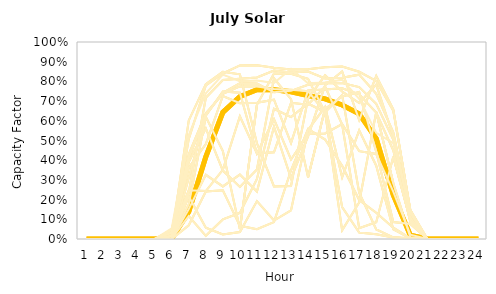
| Category | Series 0 | Series 52 | Series 53 | Series 54 | Series 55 | Series 56 | Series 57 | Series 58 | Series 59 | Series 60 | Series 61 | Series 62 | Series 63 | Series 64 | Series 65 | Series 66 | Series 67 | Series 68 | Series 69 | Series 70 | Series 71 | Series 72 | Series 73 | Series 74 | Series 75 | Series 76 | Series 77 | Series 78 | Series 79 | Series 80 | Series 81 | Series 82 | Series 83 | Series 84 | Series 85 | Series 86 | Series 87 | Series 88 | Series 89 | Series 90 | Series 91 | Series 92 | Series 93 | Series 94 | Series 95 | Series 96 | Series 97 | Series 98 | Series 99 | Series 100 | Series 101 | Series 1 | Series 2 | Series 3 | Series 4 | Series 5 | Series 6 | Series 7 | Series 8 | Series 9 | Series 10 | Series 11 | Series 12 | Series 13 | Series 14 | Series 15 | Series 16 | Series 17 | Series 18 | Series 19 | Series 20 | Series 21 | Series 22 | Series 23 | Series 24 | Series 25 | Series 26 | Series 27 | Series 28 | Series 29 | Series 30 | Series 31 | Series 32 | Series 33 | Series 34 | Series 35 | Series 36 | Series 37 | Series 38 | Series 39 | Series 40 | Series 41 | Series 42 | Series 43 | Series 44 | Series 45 | Series 46 | Series 47 | Series 48 | Series 49 | Series 50 | Series 51 |
|---|---|---|---|---|---|---|---|---|---|---|---|---|---|---|---|---|---|---|---|---|---|---|---|---|---|---|---|---|---|---|---|---|---|---|---|---|---|---|---|---|---|---|---|---|---|---|---|---|---|---|---|---|---|---|---|---|---|---|---|---|---|---|---|---|---|---|---|---|---|---|---|---|---|---|---|---|---|---|---|---|---|---|---|---|---|---|---|---|---|---|---|---|---|---|---|---|---|---|---|---|---|---|
| 0 | 0 | 0 |  |  |  | 0 |  |  |  | 0 |  |  |  | 0 |  |  |  | 0 |  | 0 |  | 0 |  | 0 |  | 0 |  |  |  | 0 |  |  |  | 0 |  |  |  | 0 |  |  |  | 0 |  |  |  | 0 |  |  |  |  | 0 | 0 | 0 |  |  |  | 0 |  |  |  | 0 |  |  |  | 0 |  |  |  | 0 |  | 0 |  | 0 |  | 0 |  | 0 |  |  |  | 0 |  |  |  | 0 |  |  |  | 0 |  |  |  | 0 |  |  |  | 0 |  |  |  |  | 0 |
| 1 | 0 | 0 |  |  |  | 0 |  |  |  | 0 |  |  |  | 0 |  |  |  | 0 |  | 0 |  | 0 |  | 0 |  | 0 |  |  |  | 0 |  |  |  | 0 |  |  |  | 0 |  |  |  | 0 |  |  |  | 0 |  |  |  |  | 0 | 0 | 0 |  |  |  | 0 |  |  |  | 0 |  |  |  | 0 |  |  |  | 0 |  | 0 |  | 0 |  | 0 |  | 0 |  |  |  | 0 |  |  |  | 0 |  |  |  | 0 |  |  |  | 0 |  |  |  | 0 |  |  |  |  | 0 |
| 2 | 0 | 0 |  |  |  | 0 |  |  |  | 0 |  |  |  | 0 |  |  |  | 0 |  | 0 |  | 0 |  | 0 |  | 0 |  |  |  | 0 |  |  |  | 0 |  |  |  | 0 |  |  |  | 0 |  |  |  | 0 |  |  |  |  | 0 | 0 | 0 |  |  |  | 0 |  |  |  | 0 |  |  |  | 0 |  |  |  | 0 |  | 0 |  | 0 |  | 0 |  | 0 |  |  |  | 0 |  |  |  | 0 |  |  |  | 0 |  |  |  | 0 |  |  |  | 0 |  |  |  |  | 0 |
| 3 | 0 | 0 |  |  |  | 0 |  |  |  | 0 |  |  |  | 0 |  |  |  | 0 |  | 0 |  | 0 |  | 0 |  | 0 |  |  |  | 0 |  |  |  | 0 |  |  |  | 0 |  |  |  | 0 |  |  |  | 0 |  |  |  |  | 0 | 0 | 0 |  |  |  | 0 |  |  |  | 0 |  |  |  | 0 |  |  |  | 0 |  | 0 |  | 0 |  | 0 |  | 0 |  |  |  | 0 |  |  |  | 0 |  |  |  | 0 |  |  |  | 0 |  |  |  | 0 |  |  |  |  | 0 |
| 4 | 0 | 0 |  |  |  | 0 |  |  |  | 0 |  |  |  | 0 |  |  |  | 0 |  | 0 |  | 0 |  | 0 |  | 0 |  |  |  | 0 |  |  |  | 0 |  |  |  | 0 |  |  |  | 0 |  |  |  | 0 |  |  |  |  | 0 | 0 | 0 |  |  |  | 0 |  |  |  | 0 |  |  |  | 0 |  |  |  | 0 |  | 0 |  | 0 |  | 0 |  | 0 |  |  |  | 0 |  |  |  | 0 |  |  |  | 0 |  |  |  | 0 |  |  |  | 0 |  |  |  |  | 0 |
| 5 | 0.003 | 0.013 |  |  |  | 0.046 |  |  |  | 0.035 |  |  |  | 0.054 |  |  |  | 0.003 |  | 0.031 |  | 0 |  | 0.017 |  | 0.002 |  |  |  | 0.015 |  |  |  | 0.001 |  |  |  | 0 |  |  |  | 0 |  |  |  | 0 |  |  |  |  | 0 | 0.003 | 0.013 |  |  |  | 0.046 |  |  |  | 0.035 |  |  |  | 0.054 |  |  |  | 0.003 |  | 0.031 |  | 0 |  | 0.017 |  | 0.002 |  |  |  | 0.015 |  |  |  | 0.001 |  |  |  | 0 |  |  |  | 0 |  |  |  | 0 |  |  |  |  | 0 |
| 6 | 0.139 | 0.602 |  |  |  | 0.43 |  |  |  | 0.247 |  |  |  | 0.528 |  |  |  | 0.236 |  | 0.41 |  | 0.152 |  | 0.39 |  | 0.117 |  |  |  | 0.362 |  |  |  | 0.175 |  |  |  | 0.508 |  |  |  | 0.069 |  |  |  | 0.311 |  |  |  |  | 0.216 | 0.139 | 0.602 |  |  |  | 0.43 |  |  |  | 0.247 |  |  |  | 0.528 |  |  |  | 0.236 |  | 0.41 |  | 0.152 |  | 0.39 |  | 0.117 |  |  |  | 0.362 |  |  |  | 0.175 |  |  |  | 0.508 |  |  |  | 0.069 |  |  |  | 0.311 |  |  |  |  | 0.216 |
| 7 | 0.417 | 0.786 |  |  |  | 0.638 |  |  |  | 0.244 |  |  |  | 0.74 |  |  |  | 0.717 |  | 0.63 |  | 0.326 |  | 0.562 |  | 0.016 |  |  |  | 0.482 |  |  |  | 0.621 |  |  |  | 0.779 |  |  |  | 0.241 |  |  |  | 0.626 |  |  |  |  | 0.057 | 0.417 | 0.786 |  |  |  | 0.638 |  |  |  | 0.244 |  |  |  | 0.74 |  |  |  | 0.717 |  | 0.63 |  | 0.326 |  | 0.562 |  | 0.016 |  |  |  | 0.482 |  |  |  | 0.621 |  |  |  | 0.779 |  |  |  | 0.241 |  |  |  | 0.626 |  |  |  |  | 0.057 |
| 8 | 0.643 | 0.849 |  |  |  | 0.736 |  |  |  | 0.351 |  |  |  | 0.834 |  |  |  | 0.807 |  | 0.742 |  | 0.267 |  | 0.347 |  | 0.099 |  |  |  | 0.726 |  |  |  | 0.446 |  |  |  | 0.84 |  |  |  | 0.247 |  |  |  | 0.749 |  |  |  |  | 0.023 | 0.643 | 0.849 |  |  |  | 0.736 |  |  |  | 0.351 |  |  |  | 0.834 |  |  |  | 0.807 |  | 0.742 |  | 0.267 |  | 0.347 |  | 0.099 |  |  |  | 0.726 |  |  |  | 0.446 |  |  |  | 0.84 |  |  |  | 0.247 |  |  |  | 0.749 |  |  |  |  | 0.023 |
| 9 | 0.723 | 0.836 |  |  |  | 0.775 |  |  |  | 0.623 |  |  |  | 0.801 |  |  |  | 0.814 |  | 0.79 |  | 0.327 |  | 0.265 |  | 0.133 |  |  |  | 0.689 |  |  |  | 0.051 |  |  |  | 0.881 |  |  |  | 0.067 |  |  |  | 0.742 |  |  |  |  | 0.035 | 0.723 | 0.836 |  |  |  | 0.775 |  |  |  | 0.623 |  |  |  | 0.801 |  |  |  | 0.814 |  | 0.79 |  | 0.327 |  | 0.265 |  | 0.133 |  |  |  | 0.689 |  |  |  | 0.051 |  |  |  | 0.881 |  |  |  | 0.067 |  |  |  | 0.742 |  |  |  |  | 0.035 |
| 10 | 0.757 | 0.486 |  |  |  | 0.774 |  |  |  | 0.434 |  |  |  | 0.805 |  |  |  | 0.82 |  | 0.789 |  | 0.241 |  | 0.353 |  | 0.304 |  |  |  | 0.691 |  |  |  | 0.681 |  |  |  | 0.881 |  |  |  | 0.05 |  |  |  | 0.434 |  |  |  |  | 0.192 | 0.757 | 0.486 |  |  |  | 0.774 |  |  |  | 0.434 |  |  |  | 0.805 |  |  |  | 0.82 |  | 0.789 |  | 0.241 |  | 0.353 |  | 0.304 |  |  |  | 0.691 |  |  |  | 0.681 |  |  |  | 0.881 |  |  |  | 0.05 |  |  |  | 0.434 |  |  |  |  | 0.192 |
| 11 | 0.758 | 0.267 |  |  |  | 0.761 |  |  |  | 0.44 |  |  |  | 0.792 |  |  |  | 0.855 |  | 0.745 |  | 0.57 |  | 0.816 |  | 0.661 |  |  |  | 0.707 |  |  |  | 0.84 |  |  |  | 0.869 |  |  |  | 0.086 |  |  |  | 0.608 |  |  |  |  | 0.094 | 0.758 | 0.267 |  |  |  | 0.761 |  |  |  | 0.44 |  |  |  | 0.792 |  |  |  | 0.855 |  | 0.745 |  | 0.57 |  | 0.816 |  | 0.661 |  |  |  | 0.707 |  |  |  | 0.84 |  |  |  | 0.869 |  |  |  | 0.086 |  |  |  | 0.608 |  |  |  |  | 0.094 |
| 12 | 0.747 | 0.269 |  |  |  | 0.757 |  |  |  | 0.691 |  |  |  | 0.864 |  |  |  | 0.845 |  | 0.752 |  | 0.308 |  | 0.71 |  | 0.619 |  |  |  | 0.487 |  |  |  | 0.838 |  |  |  | 0.86 |  |  |  | 0.349 |  |  |  | 0.404 |  |  |  |  | 0.145 | 0.747 | 0.269 |  |  |  | 0.757 |  |  |  | 0.691 |  |  |  | 0.864 |  |  |  | 0.845 |  | 0.752 |  | 0.308 |  | 0.71 |  | 0.619 |  |  |  | 0.487 |  |  |  | 0.838 |  |  |  | 0.86 |  |  |  | 0.349 |  |  |  | 0.404 |  |  |  |  | 0.145 |
| 13 | 0.728 | 0.714 |  |  |  | 0.75 |  |  |  | 0.682 |  |  |  | 0.791 |  |  |  | 0.85 |  | 0.783 |  | 0.521 |  | 0.314 |  | 0.688 |  |  |  | 0.754 |  |  |  | 0.813 |  |  |  | 0.862 |  |  |  | 0.559 |  |  |  | 0.533 |  |  |  |  | 0.553 | 0.728 | 0.714 |  |  |  | 0.75 |  |  |  | 0.682 |  |  |  | 0.791 |  |  |  | 0.85 |  | 0.783 |  | 0.521 |  | 0.314 |  | 0.688 |  |  |  | 0.754 |  |  |  | 0.813 |  |  |  | 0.862 |  |  |  | 0.559 |  |  |  | 0.533 |  |  |  |  | 0.553 |
| 14 | 0.711 | 0.831 |  |  |  | 0.641 |  |  |  | 0.773 |  |  |  | 0.795 |  |  |  | 0.815 |  | 0.79 |  | 0.78 |  | 0.661 |  | 0.644 |  |  |  | 0.759 |  |  |  | 0.643 |  |  |  | 0.871 |  |  |  | 0.505 |  |  |  | 0.536 |  |  |  |  | 0.67 | 0.711 | 0.831 |  |  |  | 0.641 |  |  |  | 0.773 |  |  |  | 0.795 |  |  |  | 0.815 |  | 0.79 |  | 0.78 |  | 0.661 |  | 0.644 |  |  |  | 0.759 |  |  |  | 0.643 |  |  |  | 0.871 |  |  |  | 0.505 |  |  |  | 0.536 |  |  |  |  | 0.67 |
| 15 | 0.68 | 0.749 |  |  |  | 0.162 |  |  |  | 0.581 |  |  |  | 0.808 |  |  |  | 0.819 |  | 0.792 |  | 0.85 |  | 0.724 |  | 0.731 |  |  |  | 0.765 |  |  |  | 0.044 |  |  |  | 0.876 |  |  |  | 0.371 |  |  |  | 0.583 |  |  |  |  | 0.313 | 0.68 | 0.749 |  |  |  | 0.162 |  |  |  | 0.581 |  |  |  | 0.808 |  |  |  | 0.819 |  | 0.792 |  | 0.85 |  | 0.724 |  | 0.731 |  |  |  | 0.765 |  |  |  | 0.044 |  |  |  | 0.876 |  |  |  | 0.371 |  |  |  | 0.583 |  |  |  |  | 0.313 |
| 16 | 0.635 | 0.691 |  |  |  | 0.033 |  |  |  | 0.055 |  |  |  | 0.712 |  |  |  | 0.834 |  | 0.771 |  | 0.604 |  | 0.746 |  | 0.235 |  |  |  | 0.735 |  |  |  | 0.185 |  |  |  | 0.849 |  |  |  | 0.198 |  |  |  | 0.446 |  |  |  |  | 0.552 | 0.635 | 0.691 |  |  |  | 0.033 |  |  |  | 0.055 |  |  |  | 0.712 |  |  |  | 0.834 |  | 0.771 |  | 0.604 |  | 0.746 |  | 0.235 |  |  |  | 0.735 |  |  |  | 0.185 |  |  |  | 0.849 |  |  |  | 0.198 |  |  |  | 0.446 |  |  |  |  | 0.552 |
| 17 | 0.51 | 0.784 |  |  |  | 0.024 |  |  |  | 0.085 |  |  |  | 0.539 |  |  |  | 0.737 |  | 0.686 |  | 0.828 |  | 0.442 |  | 0.049 |  |  |  | 0.642 |  |  |  | 0.645 |  |  |  | 0.802 |  |  |  | 0.133 |  |  |  | 0.431 |  |  |  |  | 0.372 | 0.51 | 0.784 |  |  |  | 0.024 |  |  |  | 0.085 |  |  |  | 0.539 |  |  |  | 0.737 |  | 0.686 |  | 0.828 |  | 0.442 |  | 0.049 |  |  |  | 0.642 |  |  |  | 0.645 |  |  |  | 0.802 |  |  |  | 0.133 |  |  |  | 0.431 |  |  |  |  | 0.372 |
| 18 | 0.223 | 0.521 |  |  |  | 0.007 |  |  |  | 0.418 |  |  |  | 0.487 |  |  |  | 0.542 |  | 0.505 |  | 0.658 |  | 0.086 |  | 0.008 |  |  |  | 0.45 |  |  |  | 0.284 |  |  |  | 0.651 |  |  |  | 0.057 |  |  |  | 0.241 |  |  |  |  | 0.05 | 0.223 | 0.521 |  |  |  | 0.007 |  |  |  | 0.418 |  |  |  | 0.487 |  |  |  | 0.542 |  | 0.505 |  | 0.658 |  | 0.086 |  | 0.008 |  |  |  | 0.45 |  |  |  | 0.284 |  |  |  | 0.651 |  |  |  | 0.057 |  |  |  | 0.241 |  |  |  |  | 0.05 |
| 19 | 0.019 | 0.108 |  |  |  | 0.002 |  |  |  | 0.095 |  |  |  | 0.147 |  |  |  | 0.129 |  | 0.134 |  | 0.148 |  | 0.076 |  | 0.003 |  |  |  | 0.086 |  |  |  | 0.008 |  |  |  | 0.146 |  |  |  | 0.003 |  |  |  | 0.022 |  |  |  |  | 0.004 | 0.019 | 0.108 |  |  |  | 0.002 |  |  |  | 0.095 |  |  |  | 0.147 |  |  |  | 0.129 |  | 0.134 |  | 0.148 |  | 0.076 |  | 0.003 |  |  |  | 0.086 |  |  |  | 0.008 |  |  |  | 0.146 |  |  |  | 0.003 |  |  |  | 0.022 |  |  |  |  | 0.004 |
| 20 | 0 | 0 |  |  |  | 0 |  |  |  | 0 |  |  |  | 0 |  |  |  | 0 |  | 0 |  | 0 |  | 0 |  | 0 |  |  |  | 0 |  |  |  | 0 |  |  |  | 0 |  |  |  | 0 |  |  |  | 0 |  |  |  |  | 0 | 0 | 0 |  |  |  | 0 |  |  |  | 0 |  |  |  | 0 |  |  |  | 0 |  | 0 |  | 0 |  | 0 |  | 0 |  |  |  | 0 |  |  |  | 0 |  |  |  | 0 |  |  |  | 0 |  |  |  | 0 |  |  |  |  | 0 |
| 21 | 0 | 0 |  |  |  | 0 |  |  |  | 0 |  |  |  | 0 |  |  |  | 0 |  | 0 |  | 0 |  | 0 |  | 0 |  |  |  | 0 |  |  |  | 0 |  |  |  | 0 |  |  |  | 0 |  |  |  | 0 |  |  |  |  | 0 | 0 | 0 |  |  |  | 0 |  |  |  | 0 |  |  |  | 0 |  |  |  | 0 |  | 0 |  | 0 |  | 0 |  | 0 |  |  |  | 0 |  |  |  | 0 |  |  |  | 0 |  |  |  | 0 |  |  |  | 0 |  |  |  |  | 0 |
| 22 | 0 | 0 |  |  |  | 0 |  |  |  | 0 |  |  |  | 0 |  |  |  | 0 |  | 0 |  | 0 |  | 0 |  | 0 |  |  |  | 0 |  |  |  | 0 |  |  |  | 0 |  |  |  | 0 |  |  |  | 0 |  |  |  |  | 0 | 0 | 0 |  |  |  | 0 |  |  |  | 0 |  |  |  | 0 |  |  |  | 0 |  | 0 |  | 0 |  | 0 |  | 0 |  |  |  | 0 |  |  |  | 0 |  |  |  | 0 |  |  |  | 0 |  |  |  | 0 |  |  |  |  | 0 |
| 23 | 0 | 0 |  |  |  | 0 |  |  |  | 0 |  |  |  | 0 |  |  |  | 0 |  | 0 |  | 0 |  | 0 |  | 0 |  |  |  | 0 |  |  |  | 0 |  |  |  | 0 |  |  |  | 0 |  |  |  | 0 |  |  |  |  | 0 | 0 | 0 |  |  |  | 0 |  |  |  | 0 |  |  |  | 0 |  |  |  | 0 |  | 0 |  | 0 |  | 0 |  | 0 |  |  |  | 0 |  |  |  | 0 |  |  |  | 0 |  |  |  | 0 |  |  |  | 0 |  |  |  |  | 0 |